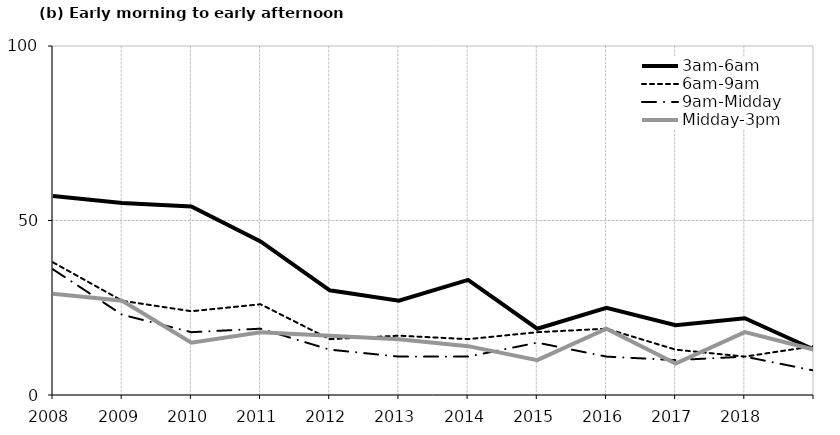
| Category | 3am-6am | 6am-9am | 9am-Midday | Midday-3pm |
|---|---|---|---|---|
| 2008.0 | 57 | 38 | 36 | 29 |
| 2009.0 | 55 | 27 | 23 | 27 |
| 2010.0 | 54 | 24 | 18 | 15 |
| 2011.0 | 44 | 26 | 19 | 18 |
| 2012.0 | 30 | 16 | 13 | 17 |
| 2013.0 | 27 | 17 | 11 | 16 |
| 2014.0 | 33 | 16 | 11 | 14 |
| 2015.0 | 19 | 18 | 15 | 10 |
| 2016.0 | 25 | 19 | 11 | 19 |
| 2017.0 | 20 | 13 | 10 | 9 |
| 2018.0 | 22 | 11 | 11 | 18 |